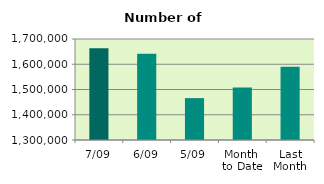
| Category | Series 0 |
|---|---|
| 7/09 | 1663036 |
| 6/09 | 1641158 |
| 5/09 | 1465886 |
| Month 
to Date | 1508364.4 |
| Last
Month | 1590000.087 |